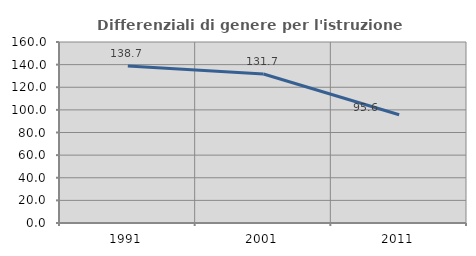
| Category | Differenziali di genere per l'istruzione superiore |
|---|---|
| 1991.0 | 138.677 |
| 2001.0 | 131.685 |
| 2011.0 | 95.64 |